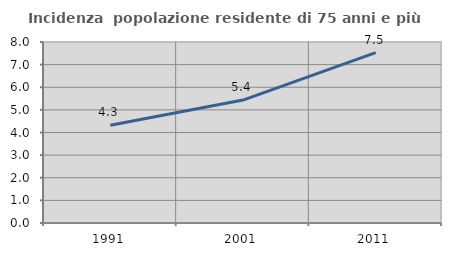
| Category | Incidenza  popolazione residente di 75 anni e più |
|---|---|
| 1991.0 | 4.317 |
| 2001.0 | 5.434 |
| 2011.0 | 7.528 |